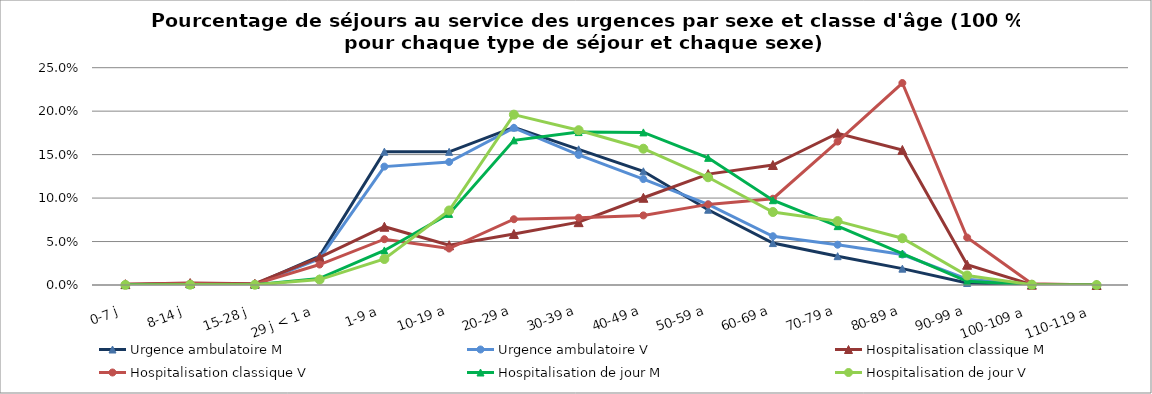
| Category | Urgence ambulatoire M | Urgence ambulatoire V | Hospitalisation classique M | Hospitalisation classique V | Hospitalisation de jour M | Hospitalisation de jour V |
|---|---|---|---|---|---|---|
| 0-7 j | 0 | 0 | 0.001 | 0.001 | 0 | 0 |
| 8-14 j | 0.002 | 0.001 | 0.002 | 0.002 | 0 | 0 |
| 15-28 j | 0.001 | 0.001 | 0.002 | 0.001 | 0 | 0 |
| 29 j < 1 a | 0.033 | 0.03 | 0.032 | 0.024 | 0.008 | 0.006 |
| 1-9 a | 0.153 | 0.136 | 0.067 | 0.053 | 0.04 | 0.03 |
| 10-19 a | 0.153 | 0.142 | 0.046 | 0.042 | 0.082 | 0.086 |
| 20-29 a | 0.181 | 0.181 | 0.059 | 0.076 | 0.166 | 0.196 |
| 30-39 a | 0.156 | 0.15 | 0.072 | 0.077 | 0.176 | 0.178 |
| 40-49 a | 0.131 | 0.122 | 0.1 | 0.08 | 0.176 | 0.157 |
| 50-59 a | 0.087 | 0.093 | 0.128 | 0.093 | 0.146 | 0.124 |
| 60-69 a | 0.048 | 0.056 | 0.138 | 0.099 | 0.098 | 0.084 |
| 70-79 a | 0.033 | 0.046 | 0.175 | 0.165 | 0.068 | 0.073 |
| 80-89 a | 0.019 | 0.035 | 0.155 | 0.232 | 0.036 | 0.054 |
| 90-99 a | 0.002 | 0.007 | 0.023 | 0.055 | 0.004 | 0.011 |
| 100-109 a | 0 | 0 | 0 | 0.001 | 0 | 0 |
| 110-119 a | 0 | 0 | 0 | 0 | 0 | 0 |